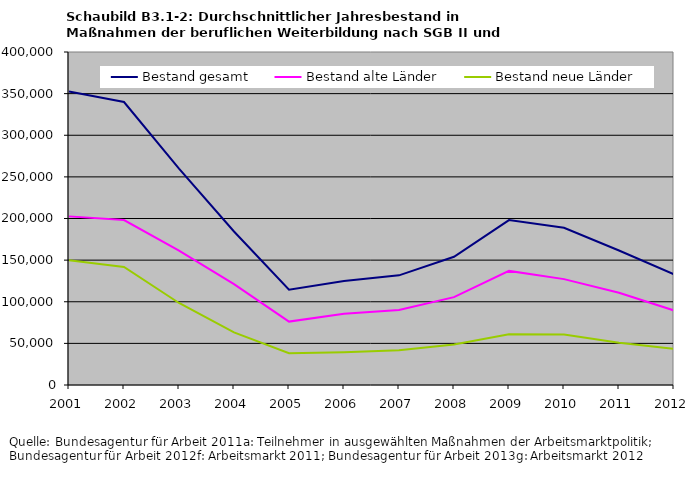
| Category | Bestand gesamt | Bestand alte Länder | Bestand neue Länder |
|---|---|---|---|
| 2001 | 352443.208 | 202552.208 | 149891 |
| 2002 | 339917.875 | 198080 | 141837.875 |
| 2003 | 259922.25 | 161404.375 | 98517.875 |
| 2004 | 184417.583 | 121239.292 | 63178.292 |
| 2005 | 114350.083 | 76157.083 | 38193 |
| 2006 | 124799.667 | 85535.417 | 39264.25 |
| 2007 | 131713.583 | 90055.667 | 41657.917 |
| 2008 | 154087.667 | 105508.25 | 48579.417 |
| 2009 | 198103.5 | 137049.417 | 61054.083 |
| 2010 | 188782 | 127177 | 60605 |
| 2011 | 161575 | 110825 | 50751 |
| 2012 | 132926 | 89593 | 43333 |